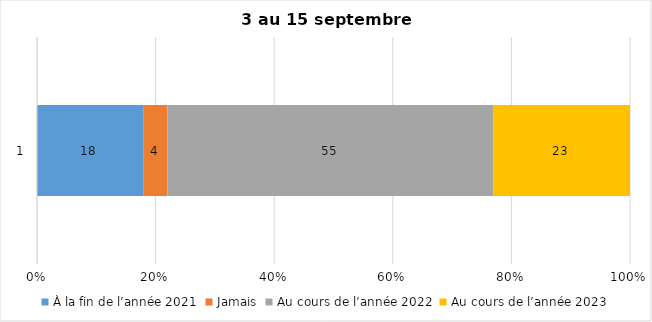
| Category | À la fin de l’année 2021 | Jamais | Au cours de l’année 2022 | Au cours de l’année 2023 |
|---|---|---|---|---|
| 0 | 18 | 4 | 55 | 23 |